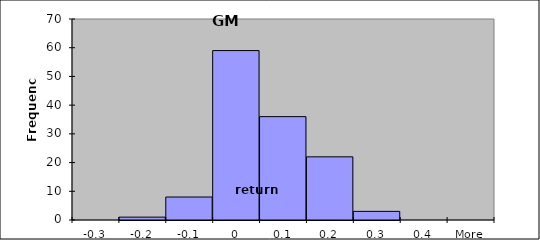
| Category | Frequency |
|---|---|
| -0.3 | 0 |
| -0.2 | 1 |
| -0.1 | 8 |
| 0 | 59 |
| 0.1 | 36 |
| 0.2 | 22 |
| 0.3 | 3 |
| 0.4 | 0 |
| More | 0 |